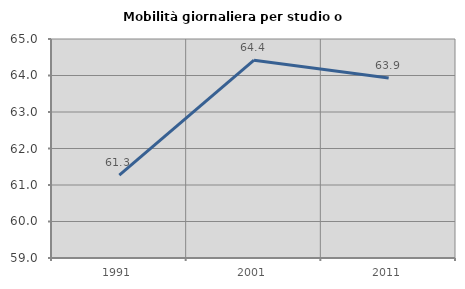
| Category | Mobilità giornaliera per studio o lavoro |
|---|---|
| 1991.0 | 61.269 |
| 2001.0 | 64.419 |
| 2011.0 | 63.931 |